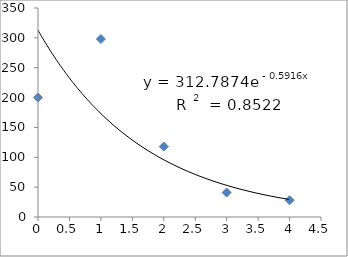
| Category | Series 0 |
|---|---|
| 0.0 | 200 |
| 1.0 | 298 |
| 2.0 | 118 |
| 3.0 | 41 |
| 4.0 | 28 |